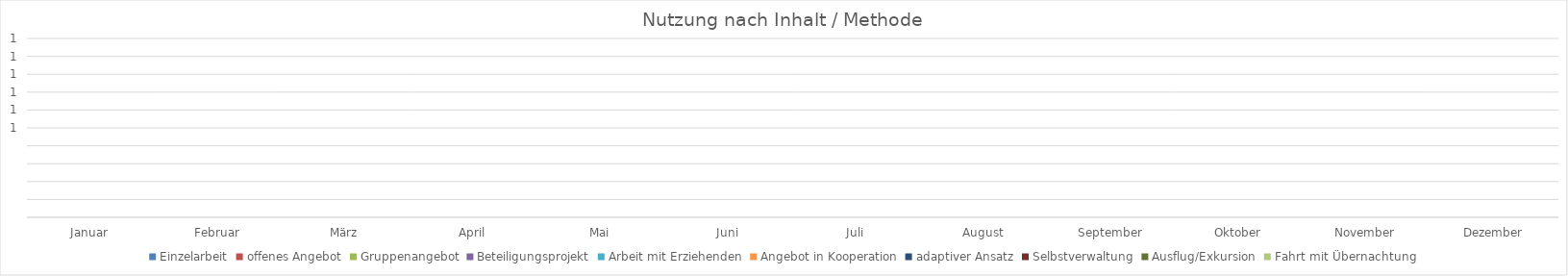
| Category | Einzelarbeit | offenes Angebot | Gruppenangebot | Beteiligungsprojekt | Arbeit mit Erziehenden | Angebot in Kooperation | adaptiver Ansatz | Selbstverwaltung | Ausflug/Exkursion | Fahrt mit Übernachtung |
|---|---|---|---|---|---|---|---|---|---|---|
| Januar | 0 | 0 | 0 | 0 | 0 | 0 | 0 | 0 | 0 | 0 |
| Februar | 0 | 0 | 0 | 0 | 0 | 0 | 0 | 0 | 0 | 0 |
| März | 0 | 0 | 0 | 0 | 0 | 0 | 0 | 0 | 0 | 0 |
| April | 0 | 0 | 0 | 0 | 0 | 0 | 0 | 0 | 0 | 0 |
| Mai | 0 | 0 | 0 | 0 | 0 | 0 | 0 | 0 | 0 | 0 |
| Juni | 0 | 0 | 0 | 0 | 0 | 0 | 0 | 0 | 0 | 0 |
| Juli | 0 | 0 | 0 | 0 | 0 | 0 | 0 | 0 | 0 | 0 |
| August | 0 | 0 | 0 | 0 | 0 | 0 | 0 | 0 | 0 | 0 |
| September | 0 | 0 | 0 | 0 | 0 | 0 | 0 | 0 | 0 | 0 |
| Oktober | 0 | 0 | 0 | 0 | 0 | 0 | 0 | 0 | 0 | 0 |
| November | 0 | 0 | 0 | 0 | 0 | 0 | 0 | 0 | 0 | 0 |
| Dezember | 0 | 0 | 0 | 0 | 0 | 0 | 0 | 0 | 0 | 0 |